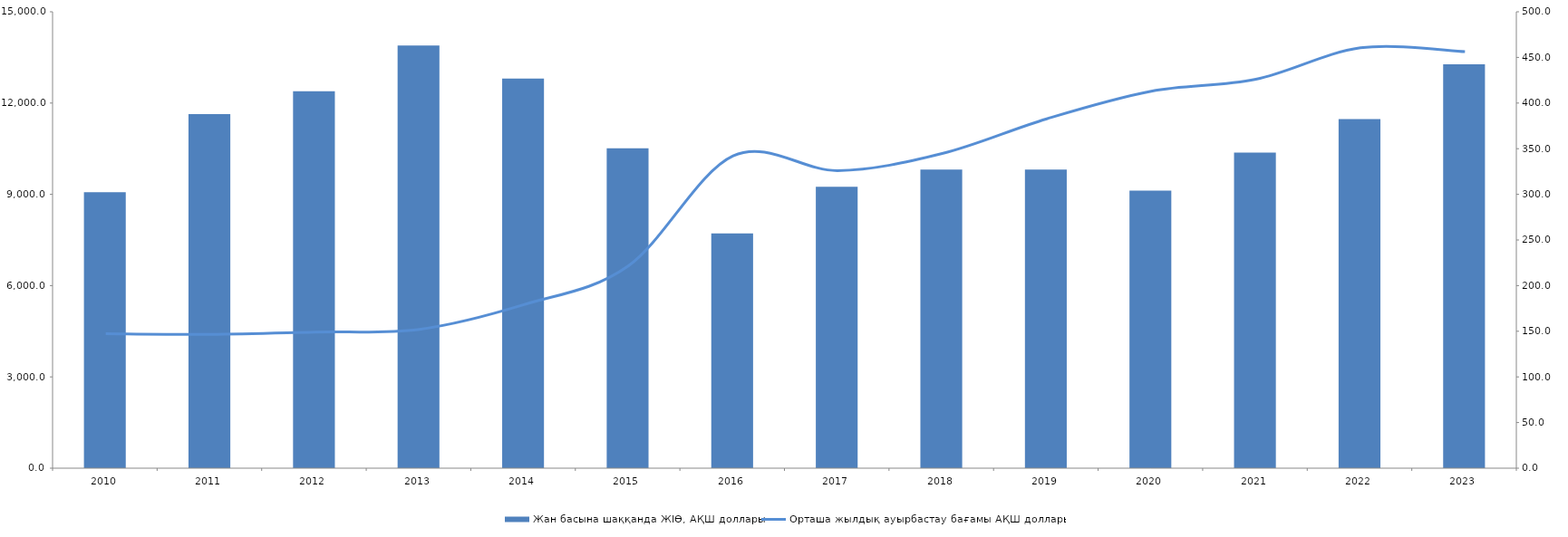
| Category | Жан басына шаққанда ЖІӨ, АҚШ доллары |
|---|---|
| 2010.0 | 9071 |
| 2011.0 | 11634.5 |
| 2012.0 | 12387.4 |
| 2013.0 | 13890.8 |
| 2014.0 | 12806.7 |
| 2015.0 | 10509.9 |
| 2016.0 | 7714.8 |
| 2017.0 | 9247.6 |
| 2018.0 | 9812.5 |
| 2019.0 | 9812.5 |
| 2020.0 | 9121.7 |
| 2021.0 | 10370.8 |
| 2022.0 | 11476.6 |
| 2023.0 | 13276.7 |